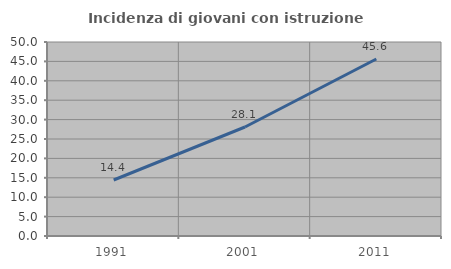
| Category | Incidenza di giovani con istruzione universitaria |
|---|---|
| 1991.0 | 14.433 |
| 2001.0 | 28.09 |
| 2011.0 | 45.614 |